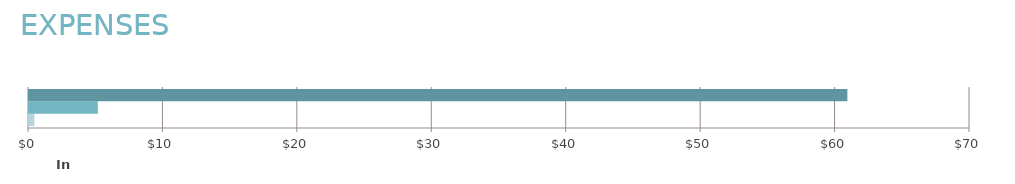
| Category | FY 2016 | FY 2017 |
|---|---|---|
| 0 | 400 | 60878 |